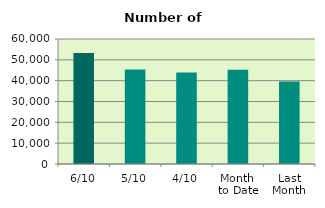
| Category | Series 0 |
|---|---|
| 6/10 | 53290 |
| 5/10 | 45326 |
| 4/10 | 43928 |
| Month 
to Date | 45281.5 |
| Last
Month | 39557.091 |